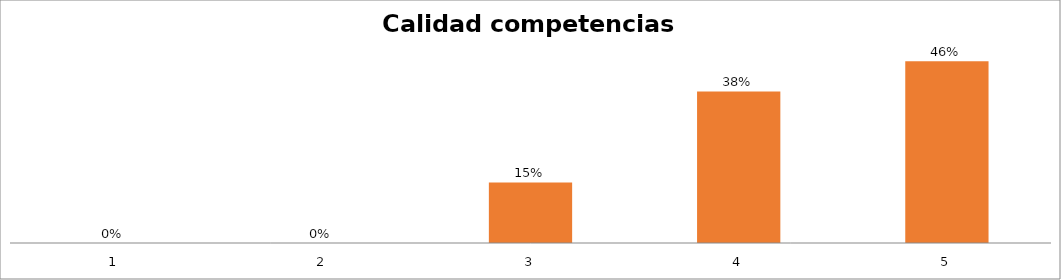
| Category | Series 1 |
|---|---|
| 0 | 0 |
| 1 | 0 |
| 2 | 0.154 |
| 3 | 0.385 |
| 4 | 0.462 |